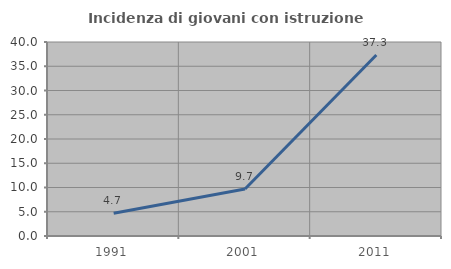
| Category | Incidenza di giovani con istruzione universitaria |
|---|---|
| 1991.0 | 4.688 |
| 2001.0 | 9.677 |
| 2011.0 | 37.313 |